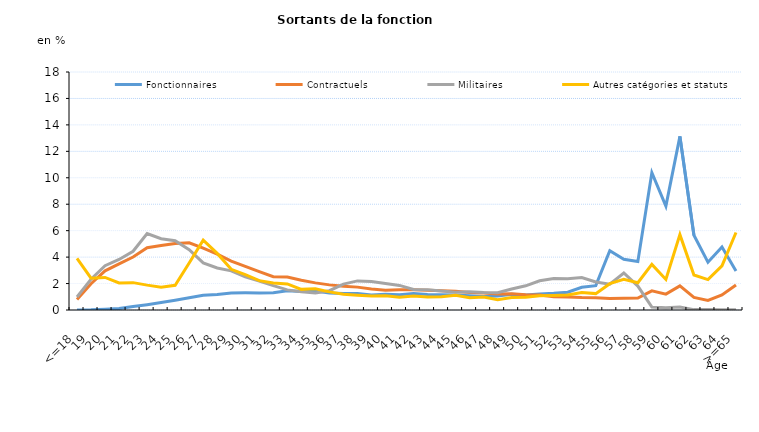
| Category | Fonctionnaires | Contractuels | Militaires | Autres catégories et statuts |
|---|---|---|---|---|
| <=18 | 0 | 0.79 | 0.98 | 3.9 |
| 19 | 0.01 | 1.99 | 2.33 | 2.41 |
| 20 | 0.05 | 2.96 | 3.35 | 2.46 |
| 21 | 0.11 | 3.49 | 3.82 | 2.05 |
| 22 | 0.26 | 4.01 | 4.44 | 2.07 |
| 23 | 0.4 | 4.71 | 5.78 | 1.88 |
| 24 | 0.56 | 4.87 | 5.39 | 1.72 |
| 25 | 0.73 | 5.03 | 5.24 | 1.87 |
| 26 | 0.92 | 5.08 | 4.56 | 3.55 |
| 27 | 1.11 | 4.68 | 3.56 | 5.28 |
| 28 | 1.18 | 4.23 | 3.18 | 4.28 |
| 29 | 1.29 | 3.7 | 2.96 | 3.08 |
| 30 | 1.3 | 3.3 | 2.5 | 2.67 |
| 31 | 1.29 | 2.9 | 2.19 | 2.22 |
| 32 | 1.31 | 2.52 | 1.84 | 2.05 |
| 33 | 1.45 | 2.49 | 1.52 | 1.97 |
| 34 | 1.4 | 2.25 | 1.38 | 1.56 |
| 35 | 1.43 | 2.05 | 1.29 | 1.6 |
| 36 | 1.29 | 1.9 | 1.46 | 1.37 |
| 37 | 1.25 | 1.79 | 1.96 | 1.19 |
| 38 | 1.24 | 1.73 | 2.2 | 1.12 |
| 39 | 1.14 | 1.59 | 2.15 | 1.05 |
| 40 | 1.19 | 1.5 | 2.01 | 1.07 |
| 41 | 1.16 | 1.53 | 1.86 | 0.97 |
| 42 | 1.24 | 1.53 | 1.55 | 1.06 |
| 43 | 1.18 | 1.49 | 1.54 | 0.99 |
| 44 | 1.16 | 1.46 | 1.43 | 1.01 |
| 45 | 1.14 | 1.42 | 1.34 | 1.11 |
| 46 | 1.07 | 1.32 | 1.38 | 0.92 |
| 47 | 1.02 | 1.29 | 1.32 | 0.98 |
| 48 | 1.06 | 1.21 | 1.31 | 0.78 |
| 49 | 1.19 | 1.22 | 1.59 | 0.95 |
| 50 | 1.13 | 1.16 | 1.83 | 0.96 |
| 51 | 1.21 | 1.13 | 2.21 | 1.07 |
| 52 | 1.26 | 1.01 | 2.39 | 1.1 |
| 53 | 1.34 | 0.99 | 2.36 | 1.13 |
| 54 | 1.72 | 0.94 | 2.46 | 1.33 |
| 55 | 1.84 | 0.92 | 2.12 | 1.24 |
| 56 | 4.49 | 0.87 | 1.95 | 1.99 |
| 57 | 3.84 | 0.89 | 2.8 | 2.32 |
| 58 | 3.67 | 0.91 | 1.81 | 2.06 |
| 59 | 10.38 | 1.45 | 0.22 | 3.45 |
| 60 | 7.86 | 1.2 | 0.17 | 2.31 |
| 61 | 13.13 | 1.82 | 0.22 | 5.7 |
| 62 | 5.65 | 0.95 | 0.03 | 2.65 |
| 63 | 3.61 | 0.73 | 0.04 | 2.3 |
| 64 | 4.76 | 1.14 | 0.01 | 3.34 |
| >=65 | 2.95 | 1.89 | 0.01 | 5.86 |